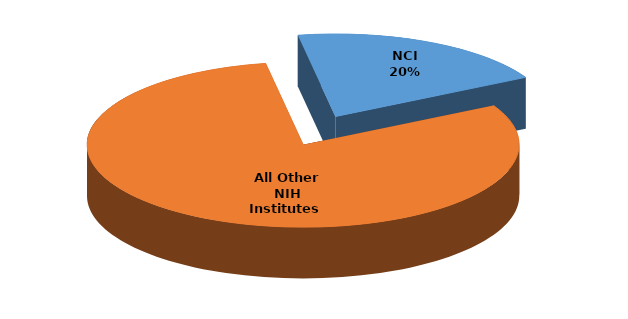
| Category | Series 0 |
|---|---|
| NCI | 394852398.077 |
| All Other NIH Institutes  | 1589193079 |